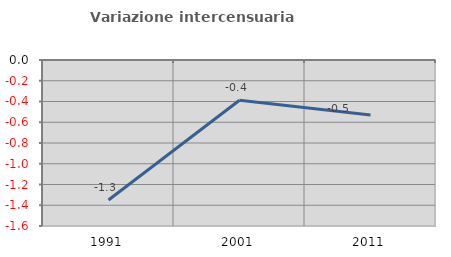
| Category | Variazione intercensuaria annua |
|---|---|
| 1991.0 | -1.349 |
| 2001.0 | -0.388 |
| 2011.0 | -0.53 |